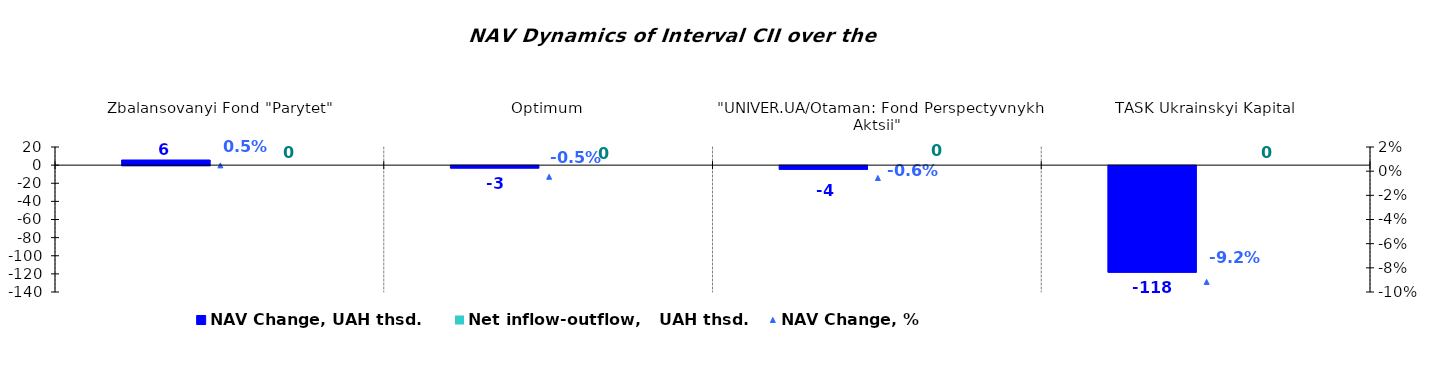
| Category | NAV Change, UAH thsd. | Net inflow-outflow,   UAH thsd. |
|---|---|---|
| Zbalansovanyi Fond "Parytet" | 5.652 | 0 |
| Optimum | -2.724 | 0 |
| "UNIVER.UA/Otaman: Fond Perspectyvnykh Aktsii" | -4.07 | 0 |
| TASK Ukrainskyi Kapital | -117.609 | 0 |